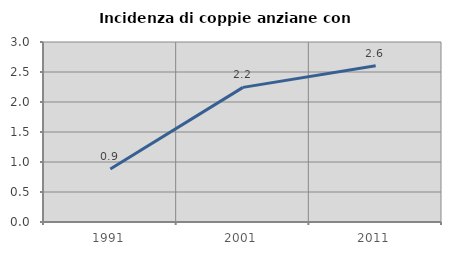
| Category | Incidenza di coppie anziane con figli |
|---|---|
| 1991.0 | 0.883 |
| 2001.0 | 2.244 |
| 2011.0 | 2.603 |